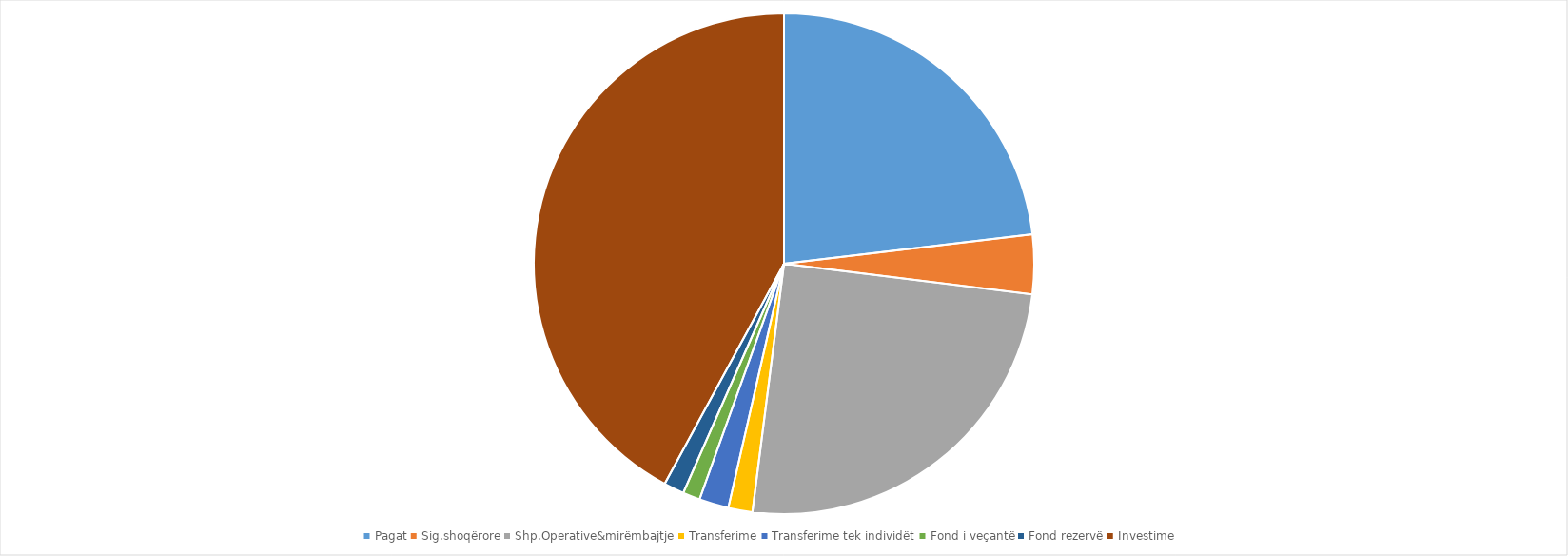
| Category | TOTALI |
|---|---|
| Pagat | 7732992510 |
| Sig.shoqërore | 1281266104 |
| Shp.Operative&mirëmbajtje | 8379805591 |
| Transferime | 520729270 |
| Transferime tek individët | 638500000 |
| Fond i veçantë | 371797600 |
| Fond rezervë | 440000000 |
| Investime | 14074448564 |